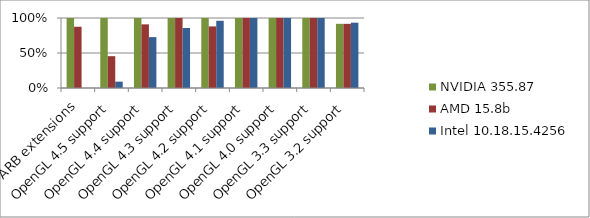
| Category | NVIDIA 355.87 | AMD 15.8b | Intel 10.18.15.4256 |
|---|---|---|---|
| ARB extensions | 1 | 0.875 | 0 |
| OpenGL 4.5 support | 1 | 0.455 | 0.091 |
| OpenGL 4.4 support | 1 | 0.909 | 0.727 |
| OpenGL 4.3 support | 1 | 1 | 0.857 |
| OpenGL 4.2 support | 1 | 0.88 | 0.96 |
| OpenGL 4.1 support | 1 | 1 | 1 |
| OpenGL 4.0 support | 1 | 1 | 1 |
| OpenGL 3.3 support | 1 | 1 | 1 |
| OpenGL 3.2 support | 0.917 | 0.917 | 0.933 |